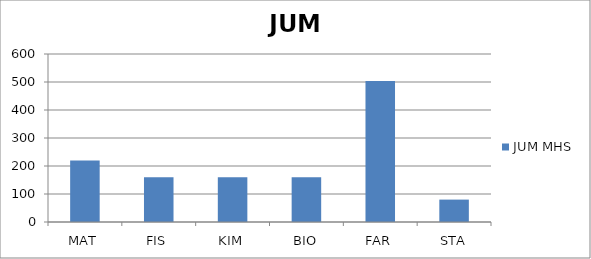
| Category | JUM MHS |
|---|---|
| MAT | 220 |
| FIS | 160 |
| KIM | 160 |
| BIO | 160 |
| FAR | 504 |
| STA | 80 |